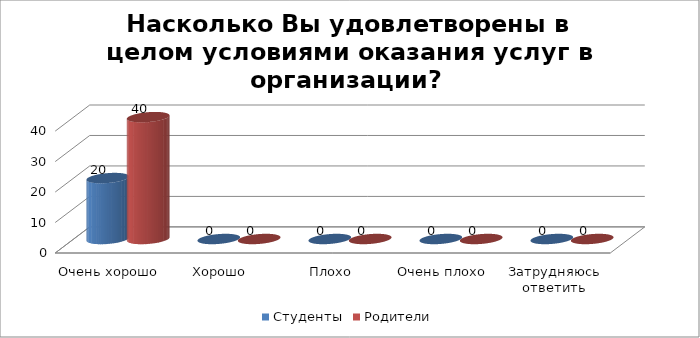
| Category | Студенты | Родители |
|---|---|---|
| Очень хорошо | 20 | 40 |
| Хорошо | 0 | 0 |
| Плохо | 0 | 0 |
| Очень плохо | 0 | 0 |
| Затрудняюсь ответить | 0 | 0 |